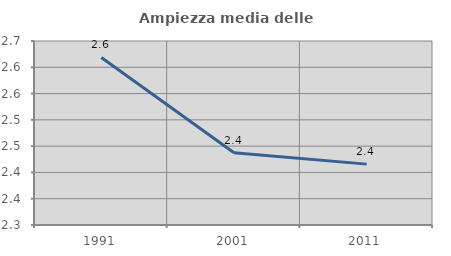
| Category | Ampiezza media delle famiglie |
|---|---|
| 1991.0 | 2.619 |
| 2001.0 | 2.438 |
| 2011.0 | 2.416 |